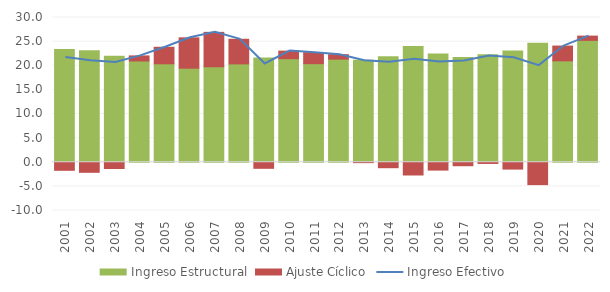
| Category | Ingreso Estructural | Ajuste Cíclico |
|---|---|---|
| 2001.0 | 23.368 | -1.669 |
| 2002.0 | 23.122 | -2.084 |
| 2003.0 | 21.965 | -1.295 |
| 2004.0 | 20.99 | 1.049 |
| 2005.0 | 20.403 | 3.427 |
| 2006.0 | 19.493 | 6.293 |
| 2007.0 | 19.79 | 7.129 |
| 2008.0 | 20.385 | 5.1 |
| 2009.0 | 21.619 | -1.259 |
| 2010.0 | 21.46 | 1.571 |
| 2011.0 | 20.429 | 2.289 |
| 2012.0 | 21.363 | 0.935 |
| 2013.0 | 21.128 | -0.082 |
| 2014.0 | 21.87 | -1.131 |
| 2015.0 | 23.966 | -2.64 |
| 2016.0 | 22.417 | -1.628 |
| 2017.0 | 21.692 | -0.72 |
| 2018.0 | 22.275 | -0.249 |
| 2019.0 | 23.076 | -1.419 |
| 2020.0 | 24.661 | -4.637 |
| 2021.0 | 21.015 | 3.065 |
| 2022.0 | 25.262 | 0.881 |